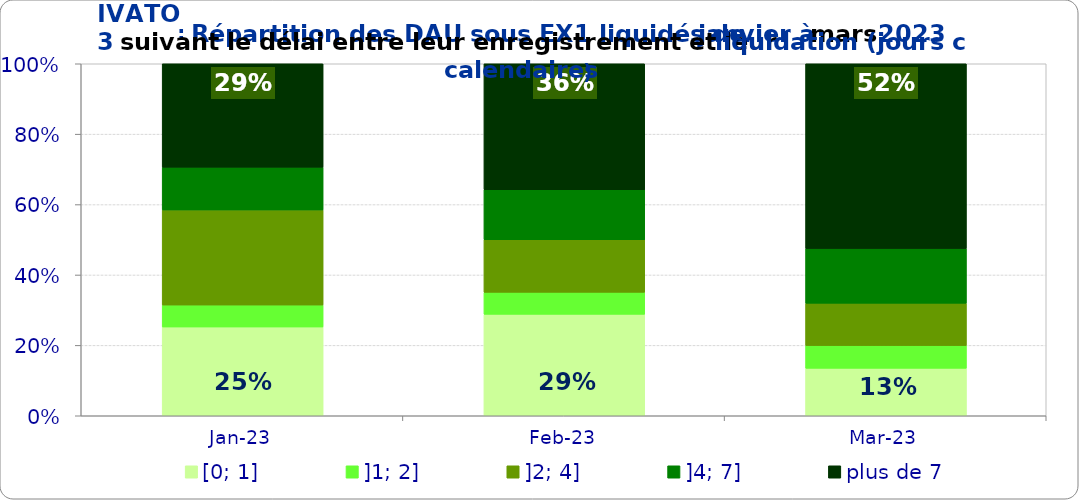
| Category | [0; 1] | ]1; 2] | ]2; 4] | ]4; 7] | plus de 7 |
|---|---|---|---|---|---|
| 2023-01-01 | 0.252 | 0.062 | 0.27 | 0.122 | 0.294 |
| 2023-02-01 | 0.288 | 0.062 | 0.149 | 0.142 | 0.358 |
| 2023-03-01 | 0.135 | 0.065 | 0.12 | 0.155 | 0.525 |